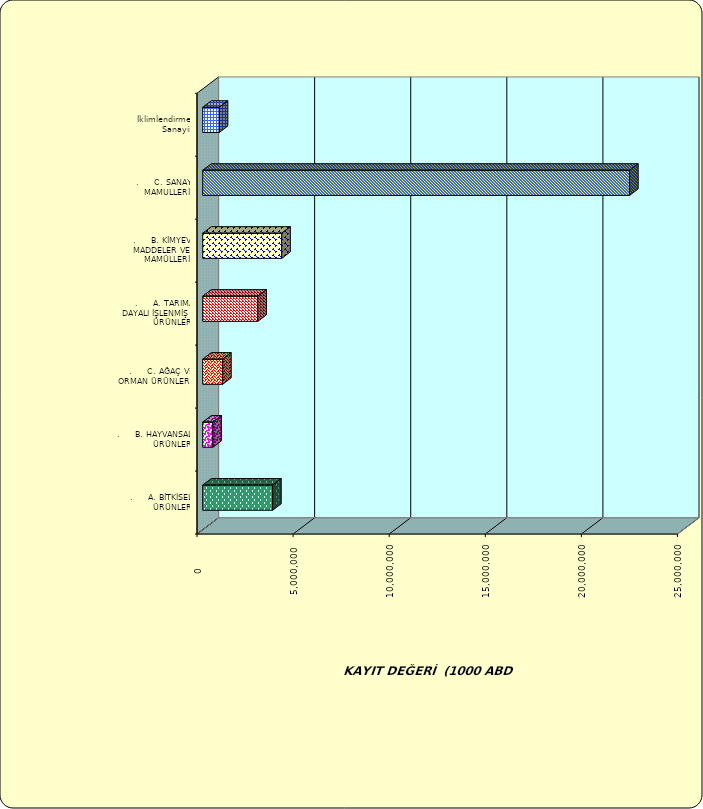
| Category | Series 0 |
|---|---|
| .     A. BİTKİSEL ÜRÜNLER | 3638327.884 |
| .     B. HAYVANSAL ÜRÜNLER | 528586.699 |
| .     C. AĞAÇ VE ORMAN ÜRÜNLERİ | 1036310.139 |
| .     A. TARIMA DAYALI İŞLENMİŞ ÜRÜNLER | 2870111.042 |
| .     B. KİMYEVİ MADDELER VE MAMÜLLERİ | 4112775.213 |
| .     C. SANAYİ MAMULLERİ | 22211239.796 |
|  İklimlendirme Sanayii | 860877.98 |